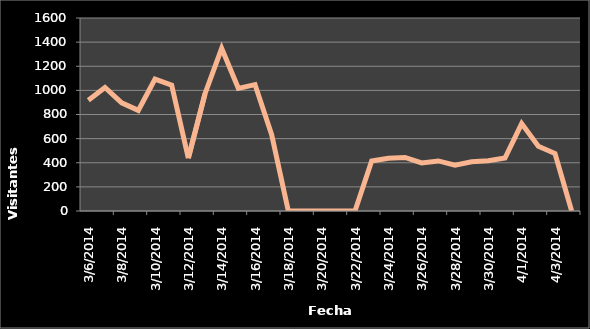
| Category | Visitantes únicos |
|---|---|
| 3/6/14 | 919 |
| 3/7/14 | 1024 |
| 3/8/14 | 897 |
| 3/9/14 | 834 |
| 3/10/14 | 1094 |
| 3/11/14 | 1044 |
| 3/12/14 | 438 |
| 3/13/14 | 972 |
| 3/14/14 | 1349 |
| 3/15/14 | 1017 |
| 3/16/14 | 1048 |
| 3/17/14 | 632 |
| 3/18/14 | 0 |
| 3/19/14 | 0 |
| 3/20/14 | 0 |
| 3/21/14 | 0 |
| 3/22/14 | 0 |
| 3/23/14 | 415 |
| 3/24/14 | 438 |
| 3/25/14 | 444 |
| 3/26/14 | 398 |
| 3/27/14 | 415 |
| 3/28/14 | 380 |
| 3/29/14 | 408 |
| 3/30/14 | 416 |
| 3/31/14 | 439 |
| 4/1/14 | 725 |
| 4/2/14 | 537 |
| 4/3/14 | 477 |
| 4/4/14 | 0 |